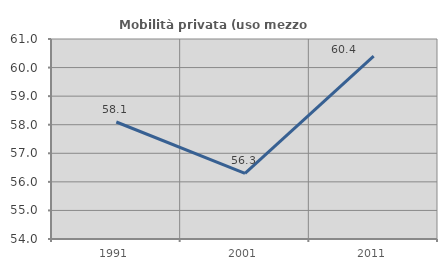
| Category | Mobilità privata (uso mezzo privato) |
|---|---|
| 1991.0 | 58.095 |
| 2001.0 | 56.296 |
| 2011.0 | 60.4 |